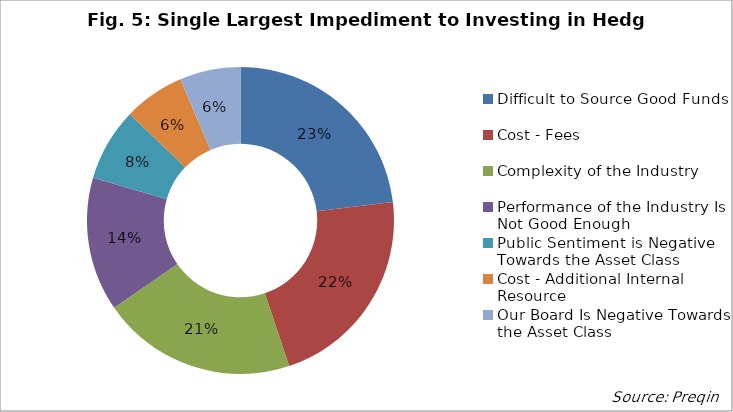
| Category | Proportion |
|---|---|
| Difficult to Source Good Funds | 0.231 |
| Cost - Fees | 0.218 |
| Complexity of the Industry | 0.205 |
| Performance of the Industry Is Not Good Enough | 0.141 |
| Public Sentiment is Negative Towards the Asset Class | 0.077 |
| Cost - Additional Internal Resource | 0.064 |
| Our Board Is Negative Towards the Asset Class | 0.064 |